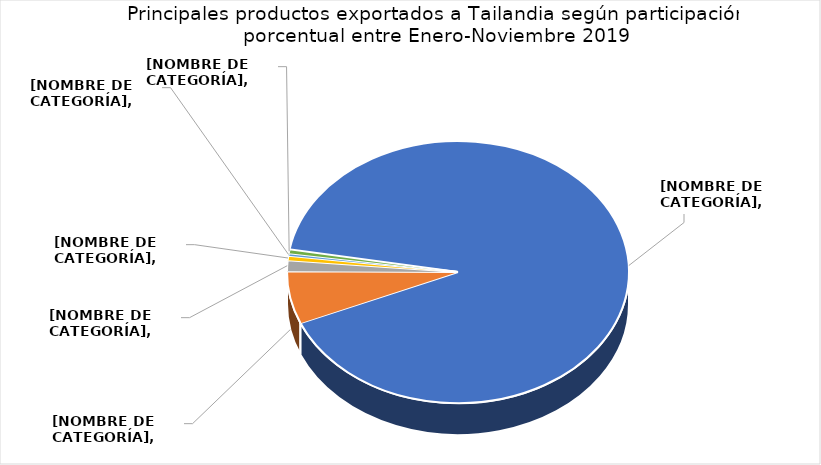
| Category | Series 0 |
|---|---|
| Desperdicios y desechos, de fundición, de hierro o acero. | 0.909 |
| Los demás desperdicios y desechos de fundición, hierro o acero. | 0.065 |
| Desperdicios y desechos, de acero aleados, excepto inoxidable. | 0.013 |
| Albacoras o atunes blancos, congelados, excepto filetes, hígados, huevas y lechas. | 0.006 |
| Desperdicios y desechos, de aluminio. | 0.003 |
| 3 productos restantes | 0.005 |